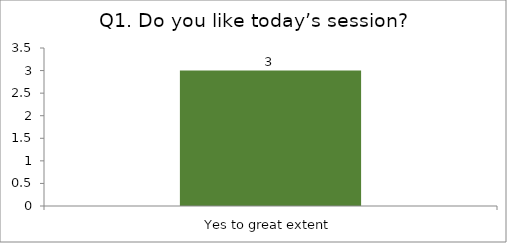
| Category | Q1. Do you like today’s session? |
|---|---|
| Yes to great extent | 3 |